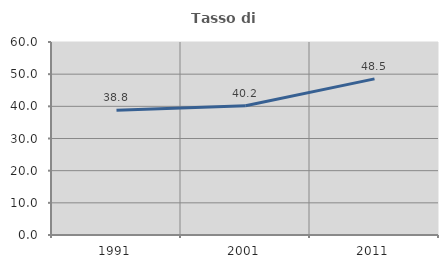
| Category | Tasso di occupazione   |
|---|---|
| 1991.0 | 38.793 |
| 2001.0 | 40.179 |
| 2011.0 | 48.529 |